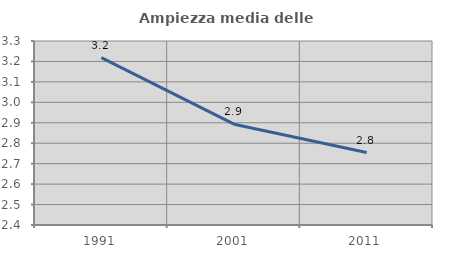
| Category | Ampiezza media delle famiglie |
|---|---|
| 1991.0 | 3.219 |
| 2001.0 | 2.893 |
| 2011.0 | 2.755 |